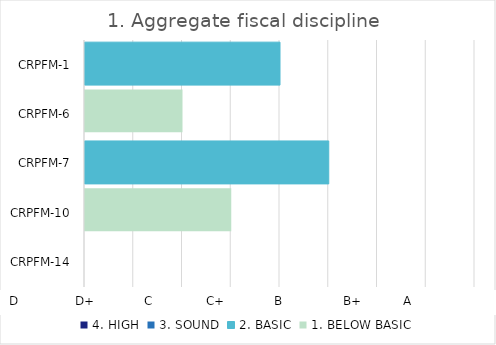
| Category | 4. HIGH | 3. SOUND | 2. BASIC | 1. BELOW BASIC |
|---|---|---|---|---|
| CRPFM-14 | 0 | 0 | 0 | 0 |
| CRPFM-10 | 0 | 0 | 0 | 1.5 |
| CRPFM-7 | 0 | 0 | 2.5 | 0 |
| CRPFM-6 | 0 | 0 | 0 | 1 |
| CRPFM-1 | 0 | 0 | 2 | 0 |